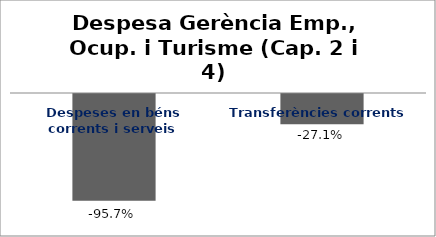
| Category | Series 0 |
|---|---|
| Despeses en béns corrents i serveis | -0.957 |
| Transferències corrents | -0.271 |